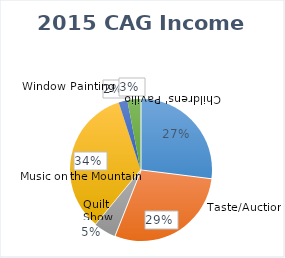
| Category | Series 0 |
|---|---|
| 0 | 0.27 |
| 1 | 0.29 |
| 2 | 0.05 |
| 3 | 0.34 |
| 4 | 0.02 |
| 5 | 0.03 |